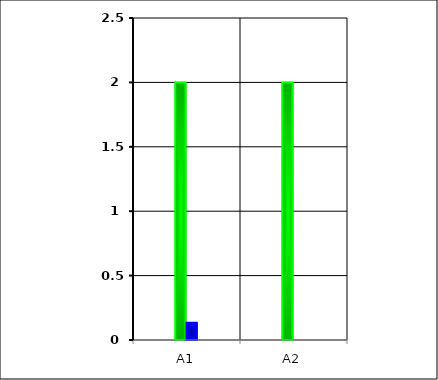
| Category | Series 0 | Series 1 | Series 2 | Series 3 | Series 4 | Series 5 | Series 6 | Series 7 |
|---|---|---|---|---|---|---|---|---|
| A1 | 0 | 0 | 0 | 2 | 0.133 | 0 | 0 | 0 |
| A2 | 0 | 0 | 0 | 2 | 0 | 0 | 0 | 0 |